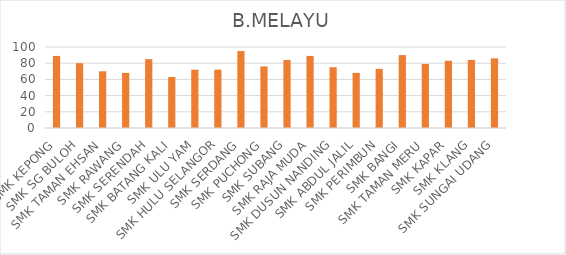
| Category | B.MELAYU |
|---|---|
| SMK KEPONG | 89 |
| SMK SG BULOH | 80 |
| SMK TAMAN EHSAN | 70 |
| SMK RAWANG | 68 |
| SMK SERENDAH | 85 |
| SMK BATANG KALI | 63 |
| SMK ULU YAM | 72 |
| SMK HULU SELANGOR | 72 |
| SMK SERDANG | 95 |
| SMK PUCHONG | 76 |
| SMK SUBANG | 84 |
| SMK RAJA MUDA | 89 |
| SMK DUSUN NANDING | 75 |
| SMK ABDUL JALIL | 68 |
| SMK PERIMBUN | 73 |
| SMK BANGI | 90 |
| SMK TAMAN MERU | 79 |
| SMK KAPAR | 83 |
| SMK KLANG | 84 |
| SMK SUNGAI UDANG | 86 |